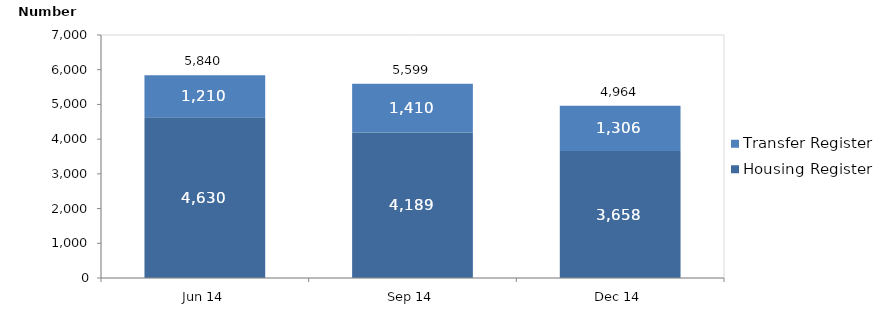
| Category | Housing Register | Transfer Register |
|---|---|---|
| Jun 14 | 4630 | 1210 |
| Sep 14 | 4189 | 1410 |
| Dec 14 | 3658 | 1306 |